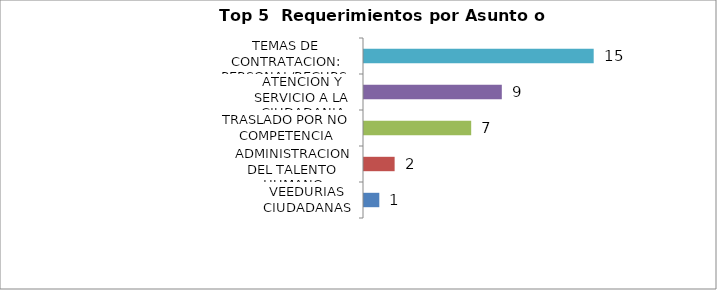
| Category | Total |
|---|---|
| VEEDURIAS CIUDADANAS | 1 |
| ADMINISTRACION DEL TALENTO HUMANO | 2 |
| TRASLADO POR NO COMPETENCIA | 7 |
| ATENCION Y SERVICIO A LA CIUDADANIA | 9 |
| TEMAS DE CONTRATACION: PERSONAL/RECURSOS FISICOS | 15 |